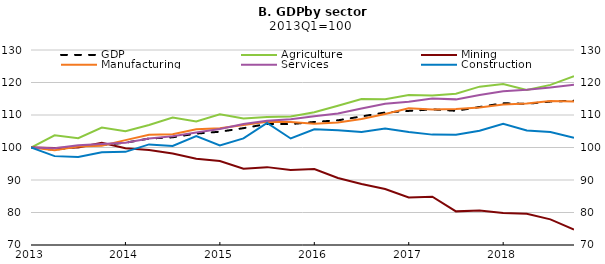
| Category | GDP | Agriculture | Mining | Manufacturing | Services |
|---|---|---|---|---|---|
| 2013-01-01 | 100 | 100 | 100 | 100 | 100 |
| 2013-04-01 | 99.304 | 103.74 | 99.874 | 99.123 | 99.76 |
| 2013-07-01 | 100.267 | 102.841 | 99.986 | 100.323 | 100.682 |
| 2013-10-01 | 100.814 | 106.117 | 101.467 | 100.557 | 101.094 |
| 2014-01-01 | 101.464 | 105.012 | 99.756 | 102.265 | 101.429 |
| 2014-04-01 | 102.754 | 106.949 | 99.261 | 103.951 | 102.783 |
| 2014-07-01 | 103.139 | 109.219 | 98.183 | 104.108 | 103.439 |
| 2014-10-01 | 104.281 | 108.024 | 96.538 | 105.609 | 104.599 |
| 2015-01-01 | 104.852 | 110.241 | 95.813 | 105.905 | 105.722 |
| 2015-04-01 | 105.95 | 108.95 | 93.448 | 106.931 | 107.2 |
| 2015-07-01 | 107.247 | 109.416 | 93.959 | 107.938 | 108.261 |
| 2015-10-01 | 107.201 | 109.567 | 93.102 | 107.821 | 108.665 |
| 2016-01-01 | 107.854 | 110.825 | 93.349 | 107.341 | 109.65 |
| 2016-04-01 | 108.365 | 112.827 | 90.607 | 107.662 | 110.467 |
| 2016-07-01 | 109.556 | 114.9 | 88.779 | 108.779 | 111.993 |
| 2016-10-01 | 110.77 | 114.83 | 87.225 | 110.333 | 113.433 |
| 2017-01-01 | 111.257 | 116.122 | 84.651 | 112.062 | 114.094 |
| 2017-04-01 | 111.733 | 116.026 | 84.864 | 111.714 | 115.073 |
| 2017-07-01 | 111.29 | 116.551 | 80.348 | 111.825 | 114.808 |
| 2017-10-01 | 112.467 | 118.728 | 80.6 | 112.342 | 116.186 |
| 2018-01-01 | 113.619 | 119.545 | 79.846 | 113.25 | 117.329 |
| 2018-04-01 | 113.438 | 117.675 | 79.611 | 113.55 | 117.748 |
| 2018-07-01 | 114.125 | 119.266 | 77.888 | 114.311 | 118.498 |
| 2018-10-01 | 114.409 | 121.934 | 74.762 | 114.141 | 119.315 |